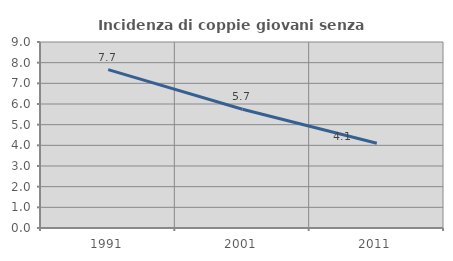
| Category | Incidenza di coppie giovani senza figli |
|---|---|
| 1991.0 | 7.666 |
| 2001.0 | 5.745 |
| 2011.0 | 4.098 |